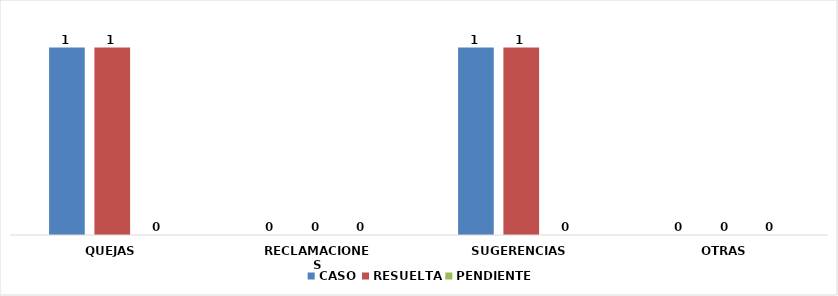
| Category | CASO | RESUELTA | PENDIENTE |
|---|---|---|---|
| QUEJAS | 1 | 1 | 0 |
| RECLAMACIONES | 0 | 0 | 0 |
| SUGERENCIAS | 1 | 1 | 0 |
| OTRAS | 0 | 0 | 0 |